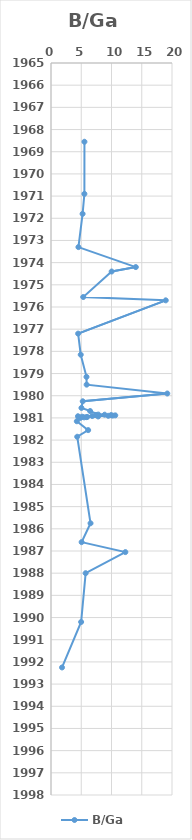
| Category | B/Ga |
|---|---|
| 5.528633437683169 | 1968.55 |
| 5.519252488686343 | 1970.9 |
| 5.222645608223953 | 1971.8 |
| 4.535109530816428 | 1973.3 |
| 14.019867176287468 | 1974.2 |
| 10.027310110069761 | 1974.4 |
| 5.327987691101852 | 1975.55 |
| 18.967724803220158 | 1975.7 |
| 4.484361139057812 | 1977.2 |
| 4.915981889482929 | 1978.15 |
| 5.866515010281919 | 1979.15 |
| 5.891536929949263 | 1979.5 |
| 19.221595510738926 | 1979.9 |
| 5.2485133106337205 | 1980.25 |
| 5.0340354595946035 | 1980.55 |
| 6.462909857290433 | 1980.69 |
| 7.828141043098964 | 1980.85 |
| 8.870346596657829 | 1980.855 |
| 7.46126208125332 | 1980.865 |
| 9.915618251793372 | 1980.875 |
| 10.621086851846163 | 1980.885 |
| 10.164427403551072 | 1980.895 |
| 9.462541002237458 | 1980.905 |
| 6.814003876110202 | 1980.915 |
| 4.45643692064347 | 1980.925 |
| 7.7961178276385485 | 1980.935 |
| 5.148366527076253 | 1980.945 |
| 5.983178225085862 | 1980.955 |
| 5.875438704499407 | 1980.965 |
| 5.473806064347203 | 1980.975 |
| 4.7116611462303215 | 1980.985 |
| 4.883729981421708 | 1980.995 |
| 4.268546163016291 | 1981.15 |
| 6.141596421213054 | 1981.55 |
| 4.335603678210553 | 1981.85 |
| 6.53415162365031 | 1985.75 |
| 5.064682871088057 | 1986.6 |
| 12.28822400071051 | 1987.05 |
| 5.727521440831789 | 1988 |
| 4.980662712898161 | 1990.2 |
| 1.824717736420076 | 1992.25 |